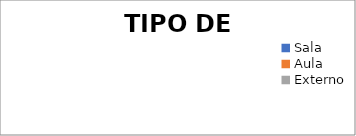
| Category | Series 0 |
|---|---|
| Sala | 0 |
| Aula | 0 |
| Externo | 0 |